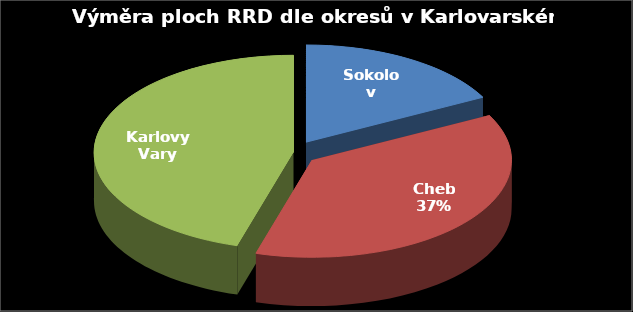
| Category | Výměra [ha] |
|---|---|
| Sokolov | 7.58 |
| Cheb | 16.25 |
| Karlovy Vary | 19.86 |